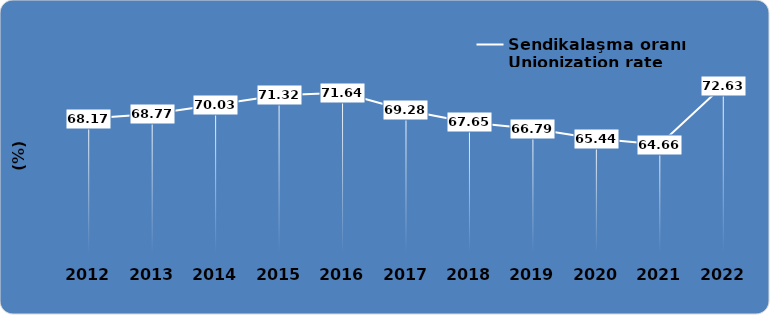
| Category | Sendikalaşma oranı
Unionization rate   |
|---|---|
| 2012.0 | 68.17 |
| 2013.0 | 68.771 |
| 2014.0 | 70.025 |
| 2015.0 | 71.317 |
| 2016.0 | 71.64 |
| 2017.0 | 69.28 |
| 2018.0 | 67.65 |
| 2019.0 | 66.79 |
| 2020.0 | 65.44 |
| 2021.0 | 64.66 |
| 2022.0 | 72.627 |